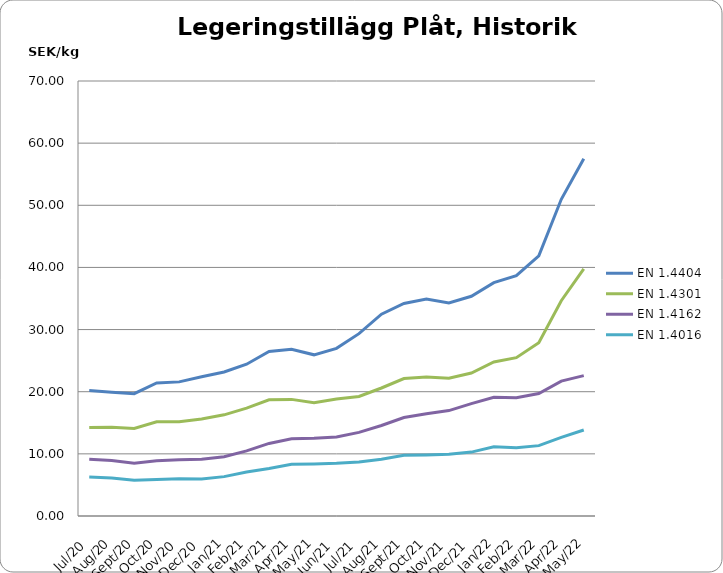
| Category | EN 1.4404 | EN 1.4301 | EN 1.4162  | EN 1.4016 |
|---|---|---|---|---|
| 2020-07-01 | 20.18 | 14.24 | 9.15 | 6.27 |
| 2020-08-01 | 19.932 | 14.286 | 8.939 | 6.099 |
| 2020-09-01 | 19.682 | 14.092 | 8.509 | 5.737 |
| 2020-10-01 | 21.4 | 15.147 | 8.892 | 5.888 |
| 2020-11-01 | 21.582 | 15.177 | 9.062 | 6.011 |
| 2020-12-01 | 22.402 | 15.617 | 9.115 | 5.945 |
| 2021-01-01 | 23.183 | 16.279 | 9.524 | 6.334 |
| 2021-02-01 | 24.425 | 17.354 | 10.488 | 7.077 |
| 2021-03-01 | 26.469 | 18.69 | 11.679 | 7.656 |
| 2021-04-01 | 26.842 | 18.766 | 12.443 | 8.336 |
| 2021-05-01 | 25.936 | 18.21 | 12.499 | 8.373 |
| 2021-06-01 | 26.983 | 18.811 | 12.71 | 8.473 |
| 2021-07-01 | 29.342 | 19.226 | 13.458 | 8.692 |
| 2021-08-01 | 32.47 | 20.6 | 14.57 | 9.13 |
| 2021-09-01 | 34.198 | 22.11 | 15.843 | 9.772 |
| 2021-10-01 | 34.921 | 22.349 | 16.463 | 9.835 |
| 2021-11-01 | 34.269 | 22.154 | 16.96 | 9.932 |
| 2021-12-01 | 35.354 | 23.005 | 18.083 | 10.283 |
| 2022-01-01 | 37.55 | 24.78 | 19.09 | 11.13 |
| 2022-02-01 | 38.671 | 25.483 | 19.037 | 10.978 |
| 2022-03-01 | 41.871 | 27.88 | 19.71 | 11.325 |
| 2022-04-01 | 50.965 | 34.648 | 21.714 | 12.643 |
| 2022-05-01 | 57.492 | 39.761 | 22.591 | 13.846 |